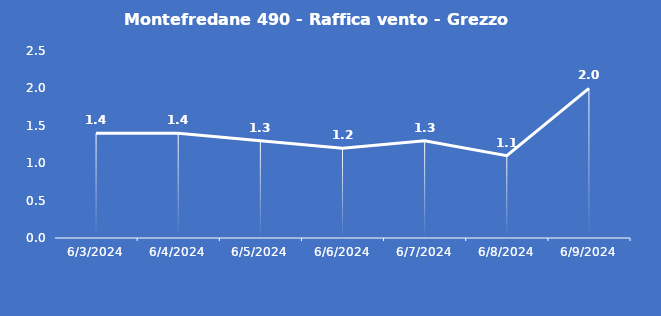
| Category | Montefredane 490 - Raffica vento - Grezzo (m/s) |
|---|---|
| 6/3/24 | 1.4 |
| 6/4/24 | 1.4 |
| 6/5/24 | 1.3 |
| 6/6/24 | 1.2 |
| 6/7/24 | 1.3 |
| 6/8/24 | 1.1 |
| 6/9/24 | 2 |